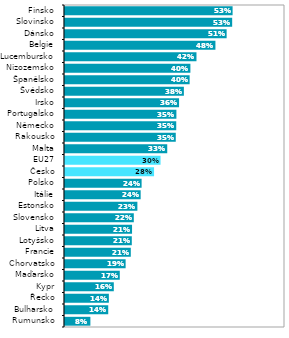
| Category | Series 1 |
|---|---|
| Rumunsko | 0.081 |
| Bulharsko | 0.138 |
| Řecko | 0.14 |
| Kypr | 0.155 |
| Maďarsko | 0.174 |
| Chorvatsko | 0.193 |
| Francie | 0.209 |
| Lotyšsko | 0.213 |
| Litva | 0.213 |
| Slovensko | 0.219 |
| Estonsko | 0.23 |
| Itálie | 0.241 |
| Polsko | 0.244 |
| Česko | 0.283 |
| EU27 | 0.304 |
| Malta | 0.325 |
| Rakousko | 0.352 |
| Německo | 0.354 |
| Portugalsko | 0.354 |
| Irsko | 0.363 |
| Švédsko | 0.378 |
| Španělsko | 0.397 |
| Nizozemsko | 0.399 |
| Lucembursko | 0.418 |
| Belgie | 0.479 |
| Dánsko | 0.514 |
| Slovinsko | 0.532 |
| Finsko | 0.533 |